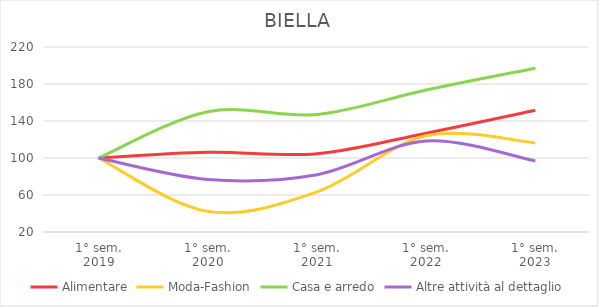
| Category | Alimentare | Moda-Fashion | Casa e arredo | Altre attività al dettaglio |
|---|---|---|---|---|
| 1° sem.
2019 | 100 | 100 | 100 | 100 |
| 1° sem.
2020 | 106.186 | 42.308 | 150 | 76.777 |
| 1° sem.
2021 | 104.639 | 63.462 | 147.059 | 81.991 |
| 1° sem.
2022 | 126.804 | 124.038 | 173.529 | 118.483 |
| 1° sem.
2023 | 151.546 | 116.346 | 197.059 | 96.682 |